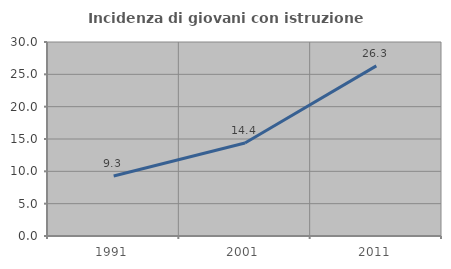
| Category | Incidenza di giovani con istruzione universitaria |
|---|---|
| 1991.0 | 9.29 |
| 2001.0 | 14.391 |
| 2011.0 | 26.304 |